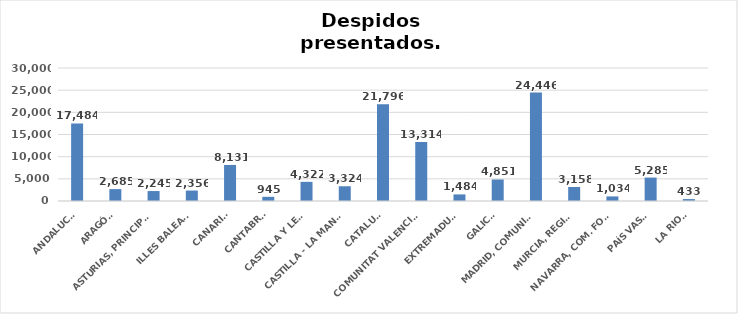
| Category | Series 0 |
|---|---|
| ANDALUCÍA | 17484 |
| ARAGÓN | 2685 |
| ASTURIAS, PRINCIPADO | 2245 |
| ILLES BALEARS | 2356 |
| CANARIAS | 8131 |
| CANTABRIA | 945 |
| CASTILLA Y LEÓN | 4322 |
| CASTILLA - LA MANCHA | 3324 |
| CATALUÑA | 21796 |
| COMUNITAT VALENCIANA | 13314 |
| EXTREMADURA | 1484 |
| GALICIA | 4851 |
| MADRID, COMUNIDAD | 24446 |
| MURCIA, REGIÓN | 3158 |
| NAVARRA, COM. FORAL | 1034 |
| PAÍS VASCO | 5285 |
| LA RIOJA | 433 |